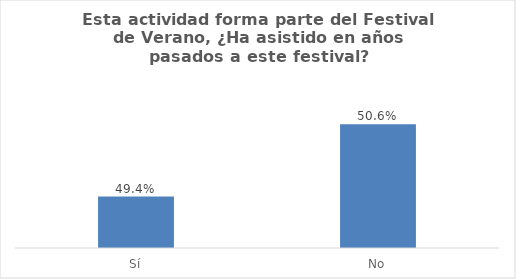
| Category | Series 0 |
|---|---|
| Sí | 0.494 |
| No | 0.506 |